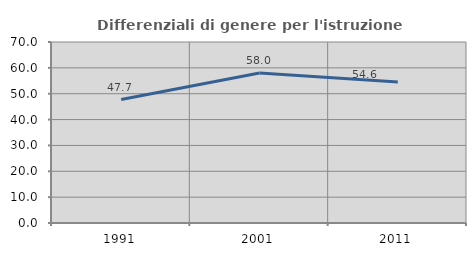
| Category | Differenziali di genere per l'istruzione superiore |
|---|---|
| 1991.0 | 47.74 |
| 2001.0 | 57.99 |
| 2011.0 | 54.56 |